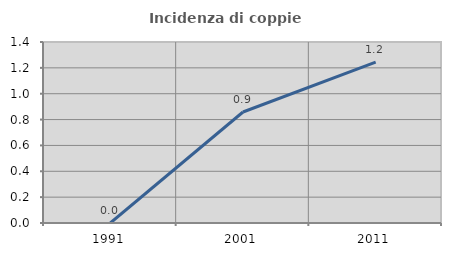
| Category | Incidenza di coppie miste |
|---|---|
| 1991.0 | 0 |
| 2001.0 | 0.858 |
| 2011.0 | 1.245 |